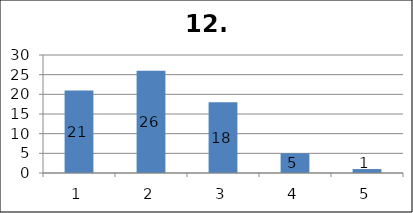
| Category | Series 1 |
|---|---|
| 0 | 21 |
| 1 | 26 |
| 2 | 18 |
| 3 | 5 |
| 4 | 1 |